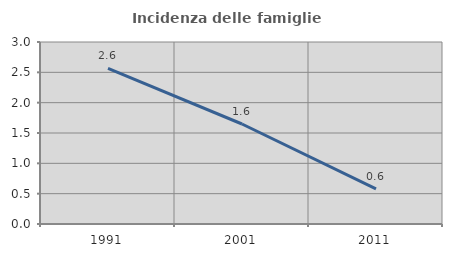
| Category | Incidenza delle famiglie numerose |
|---|---|
| 1991.0 | 2.564 |
| 2001.0 | 1.648 |
| 2011.0 | 0.578 |